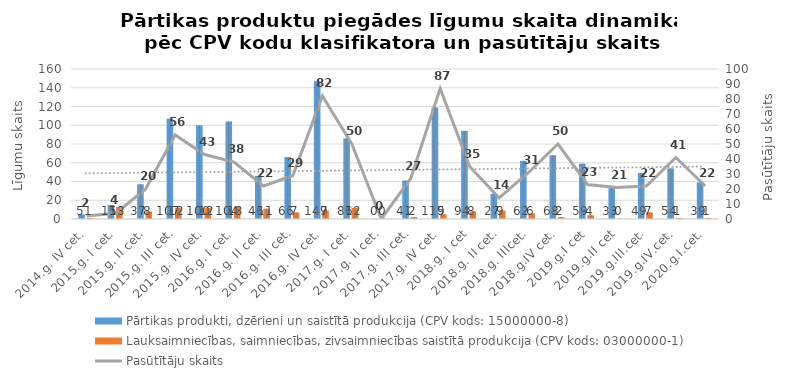
| Category | Pārtikas produkti, dzērieni un saistītā produkcija (CPV kods: 15000000-8) | Lauksaimniecības, saimniecības, zivsaimniecības saistītā produkcija (CPV kods: 03000000-1) |
|---|---|---|
| 2014.g. IV cet. | 5 | 1 |
| 2015.g. I cet. | 15 | 13 |
| 2015.g. II cet. | 37 | 8 |
| 2015.g. III cet. | 107 | 12 |
| 2015.g. IV cet. | 100 | 12 |
| 2016.g. I cet. | 104 | 13 |
| 2016.g. II cet. | 46 | 11 |
| 2016.g. III cet. | 66 | 7 |
| 2016.g. IV cet. | 147 | 9 |
| 2017.g. I cet. | 86 | 12 |
| 2017.g. II cet. | 0 | 0 |
| 2017.g. III cet. | 41 | 2 |
| 2017.g. IV cet. | 119 | 5 |
| 2018.g. I cet | 94 | 8 |
| 2018.g. II cet. | 27 | 9 |
| 2018.g. IIIcet. | 62 | 6 |
| 2018.g.IV cet. | 68 | 2 |
| 2019.g.I cet | 59 | 4 |
| 2019.g.II cet | 33 | 0 |
| 2019.g.III.cet. | 49 | 7 |
| 2019.g.IV.cet. | 54 | 1 |
| 2020.g.I.cet. | 39 | 1 |